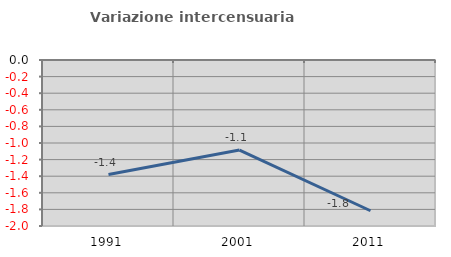
| Category | Variazione intercensuaria annua |
|---|---|
| 1991.0 | -1.38 |
| 2001.0 | -1.085 |
| 2011.0 | -1.816 |